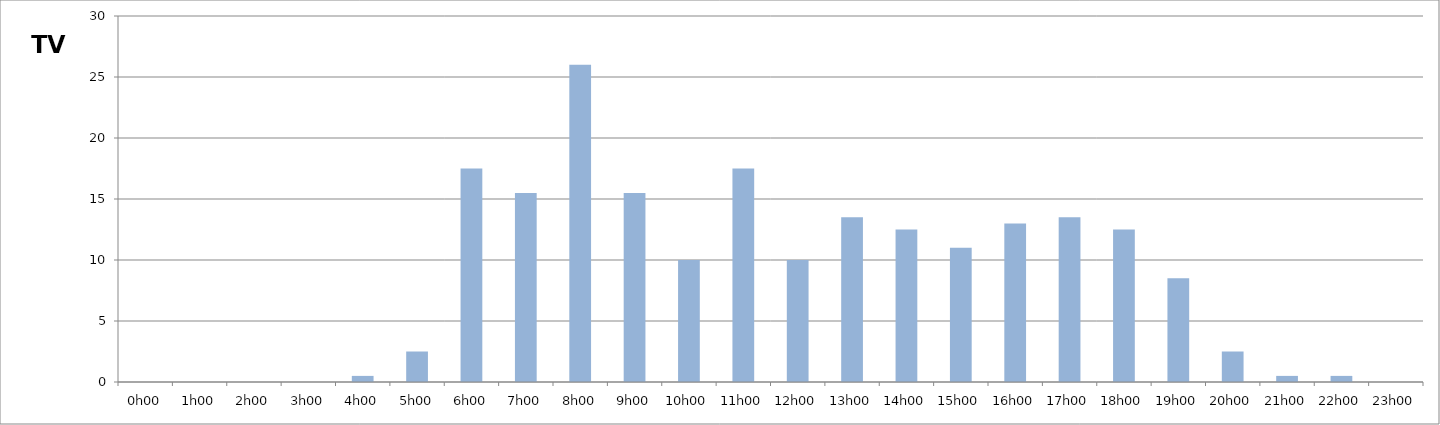
| Category | TV |
|---|---|
| 0.0 | 0 |
| 0.041666666666666664 | 0 |
| 0.08333333333333333 | 0 |
| 0.125 | 0 |
| 0.16666666666666666 | 0.5 |
| 0.20833333333333334 | 2.5 |
| 0.25 | 17.5 |
| 0.2916666666666667 | 15.5 |
| 0.3333333333333333 | 26 |
| 0.375 | 15.5 |
| 0.4166666666666667 | 10 |
| 0.4583333333333333 | 17.5 |
| 0.5 | 10 |
| 0.5416666666666666 | 13.5 |
| 0.5833333333333334 | 12.5 |
| 0.625 | 11 |
| 0.6666666666666666 | 13 |
| 0.7083333333333334 | 13.5 |
| 0.75 | 12.5 |
| 0.7916666666666666 | 8.5 |
| 0.8333333333333334 | 2.5 |
| 0.875 | 0.5 |
| 0.9166666666666666 | 0.5 |
| 0.9583333333333334 | 0 |